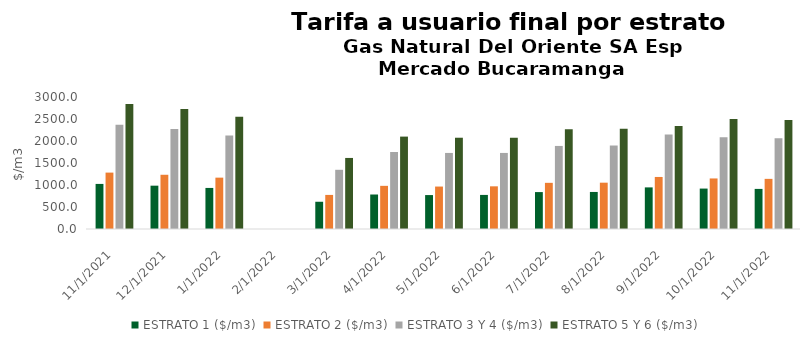
| Category | ESTRATO 1 ($/m3) | ESTRATO 2 ($/m3) | ESTRATO 3 Y 4 ($/m3) | ESTRATO 5 Y 6 ($/m3) |
|---|---|---|---|---|
| 11/1/21 | 1024.52 | 1281.8 | 2369.02 | 2842.824 |
| 12/1/21 | 984.71 | 1232.46 | 2271.12 | 2725.344 |
| 1/1/22 | 933.31 | 1167.13 | 2124.99 | 2549.988 |
| 3/1/22 | 619.21 | 774.52 | 1345.69 | 1614.828 |
| 4/1/22 | 784.02 | 980.83 | 1750.02 | 2100.024 |
| 5/1/22 | 771.14 | 964.71 | 1728.64 | 2074.368 |
| 6/1/22 | 774.53 | 969.94 | 1728.64 | 2074.368 |
| 7/1/22 | 839.04 | 1049.2 | 1887.96 | 2265.552 |
| 8/1/22 | 841.95 | 1052.81 | 1897.33 | 2276.796 |
| 9/1/22 | 945.64 | 1182.71 | 2149.77 | 2341.1 |
| 10/1/22 | 918.84 | 1148.91 | 2085 | 2502 |
| 11/1/22 | 911.27 | 1139.55 | 2063.64 | 2476.368 |